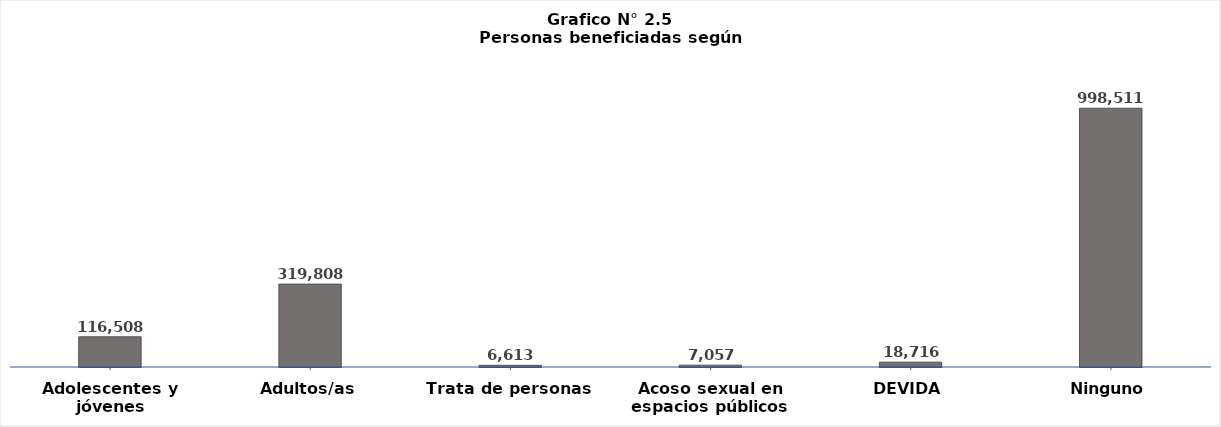
| Category | Series 0 |
|---|---|
| Adolescentes y jóvenes | 116508 |
| Adultos/as | 319808 |
| Trata de personas | 6613 |
| Acoso sexual en espacios públicos | 7057 |
| DEVIDA | 18716 |
| Ninguno | 998511 |